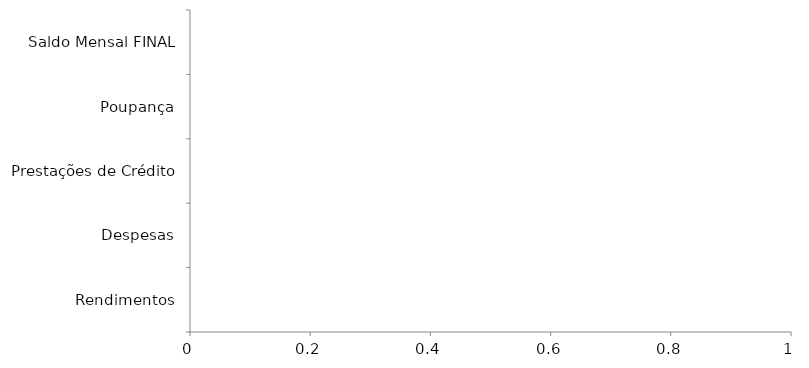
| Category | Series 0 | Series 1 | Series 2 | Series 3 |
|---|---|---|---|---|
| Rendimentos |  |  |  | 0 |
| Despesas |  |  |  | 0 |
| Prestações de Crédito |  |  |  | 0 |
| Poupança |  |  |  | 0 |
| Saldo Mensal FINAL |  |  |  | 0 |